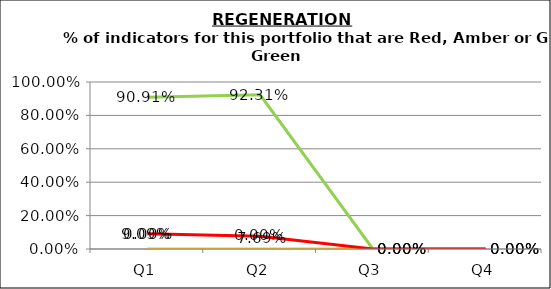
| Category | Green | Amber | Red |
|---|---|---|---|
| Q1 | 0.909 | 0 | 0.091 |
| Q2 | 0.923 | 0 | 0.077 |
| Q3 | 0 | 0 | 0 |
| Q4 | 0 | 0 | 0 |